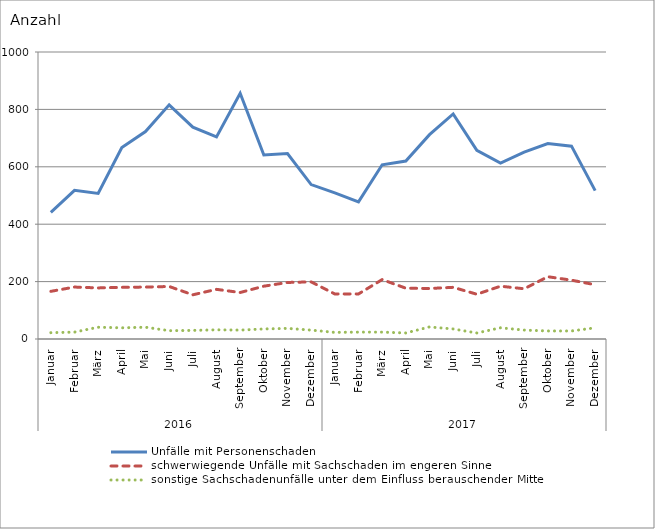
| Category | Unfälle mit Personenschaden | schwerwiegende Unfälle mit Sachschaden im engeren Sinne | sonstige Sachschadenunfälle unter dem Einfluss berauschender Mittel |
|---|---|---|---|
| 0 | 441 | 166 | 22 |
| 1 | 518 | 181 | 24 |
| 2 | 507 | 178 | 41 |
| 3 | 667 | 180 | 39 |
| 4 | 723 | 181 | 41 |
| 5 | 816 | 183 | 29 |
| 6 | 738 | 154 | 30 |
| 7 | 704 | 173 | 32 |
| 8 | 856 | 162 | 31 |
| 9 | 641 | 184 | 35 |
| 10 | 646 | 197 | 37 |
| 11 | 538 | 199 | 31 |
| 12 | 509 | 157 | 23 |
| 13 | 478 | 157 | 24 |
| 14 | 607 | 207 | 24 |
| 15 | 620 | 177 | 21 |
| 16 | 712 | 176 | 42 |
| 17 | 784 | 180 | 35 |
| 18 | 657 | 156 | 21 |
| 19 | 613 | 184 | 39 |
| 20 | 651 | 175 | 31 |
| 21 | 681 | 217 | 28 |
| 22 | 672 | 205 | 28 |
| 23 | 517 | 189 | 39 |